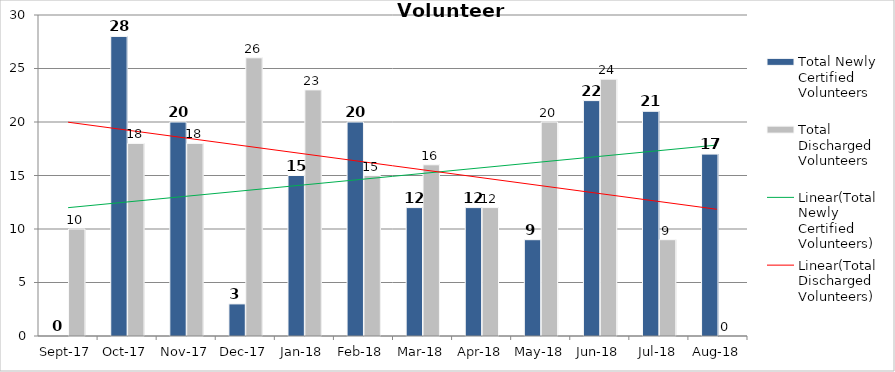
| Category | Total Newly Certified Volunteers | Total Discharged Volunteers |
|---|---|---|
| 2017-09-01 | 0 | 10 |
| 2017-10-01 | 28 | 18 |
| 2017-11-01 | 20 | 18 |
| 2017-12-01 | 3 | 26 |
| 2018-01-01 | 15 | 23 |
| 2018-02-01 | 20 | 15 |
| 2018-03-01 | 12 | 16 |
| 2018-04-01 | 12 | 12 |
| 2018-05-01 | 9 | 20 |
| 2018-06-01 | 22 | 24 |
| 2018-07-01 | 21 | 9 |
| 2018-08-01 | 17 | 0 |